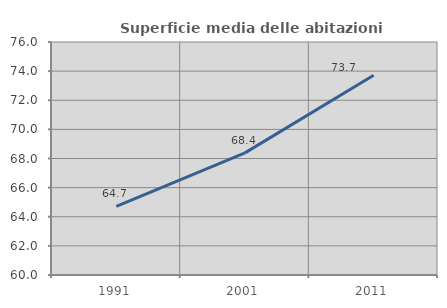
| Category | Superficie media delle abitazioni occupate |
|---|---|
| 1991.0 | 64.72 |
| 2001.0 | 68.387 |
| 2011.0 | 73.719 |